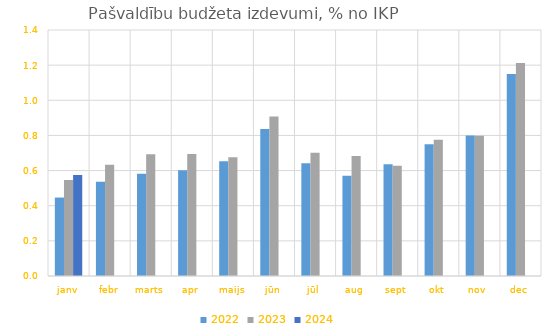
| Category | 2022 | 2023 | 2024 |
|---|---|---|---|
| janv | 0.446 | 0.546 | 0.574 |
| febr | 0.537 | 0.633 | 0 |
| marts | 0.582 | 0.693 | 0 |
| apr | 0.602 | 0.694 | 0 |
| maijs | 0.653 | 0.676 | 0 |
| jūn | 0.837 | 0.907 | 0 |
| jūl | 0.642 | 0.702 | 0 |
| aug | 0.571 | 0.683 | 0 |
| sept | 0.636 | 0.627 | 0 |
| okt | 0.75 | 0.775 | 0 |
| nov | 0.799 | 0.798 | 0 |
| dec | 1.149 | 1.212 | 0 |